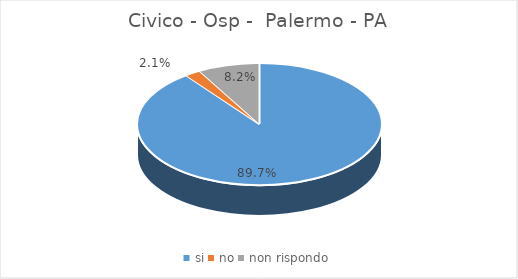
| Category | Civico - Osp -  Palermo - PA |
|---|---|
| si | 0.897 |
| no | 0.021 |
| non rispondo | 0.082 |